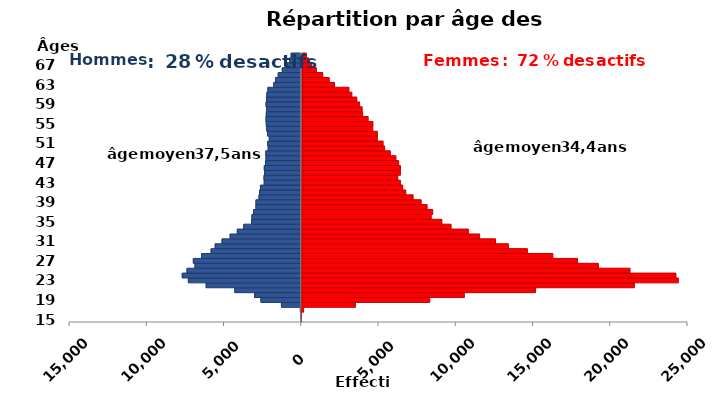
| Category | age | Homme | Femme |
|---|---|---|---|
| 15.0 | 15 | -3 | 1 |
| 16.0 | 16 | -20 | 28 |
| 17.0 | 17 | -58 | 170 |
| 18.0 | 18 | -1283 | 3526 |
| 19.0 | 19 | -2607 | 8332 |
| 20.0 | 20 | -3023 | 10571 |
| 21.0 | 21 | -4300 | 15178 |
| 22.0 | 22 | -6153 | 21572 |
| 23.0 | 23 | -7304 | 24417 |
| 24.0 | 24 | -7702 | 24260 |
| 25.0 | 25 | -7390 | 21288 |
| 26.0 | 26 | -6877 | 19240 |
| 27.0 | 27 | -6984 | 17889 |
| 28.0 | 28 | -6452 | 16291 |
| 29.0 | 29 | -5832 | 14640 |
| 30.0 | 30 | -5570 | 13410 |
| 31.0 | 31 | -5125 | 12574 |
| 32.0 | 32 | -4603 | 11548 |
| 33.0 | 33 | -4138 | 10814 |
| 34.0 | 34 | -3723 | 9696 |
| 35.0 | 35 | -3220 | 9101 |
| 36.0 | 36 | -3190 | 8407 |
| 37.0 | 37 | -3088 | 8506 |
| 38.0 | 38 | -2934 | 8141 |
| 39.0 | 39 | -2928 | 7755 |
| 40.0 | 40 | -2734 | 7233 |
| 41.0 | 41 | -2695 | 6757 |
| 42.0 | 42 | -2641 | 6556 |
| 43.0 | 43 | -2395 | 6405 |
| 44.0 | 44 | -2412 | 6237 |
| 45.0 | 45 | -2366 | 6406 |
| 46.0 | 46 | -2392 | 6409 |
| 47.0 | 47 | -2311 | 6288 |
| 48.0 | 48 | -2280 | 6113 |
| 49.0 | 49 | -2295 | 5753 |
| 50.0 | 50 | -2139 | 5380 |
| 51.0 | 51 | -2171 | 5280 |
| 52.0 | 52 | -2066 | 4903 |
| 53.0 | 53 | -2184 | 4904 |
| 54.0 | 54 | -2234 | 4606 |
| 55.0 | 55 | -2263 | 4617 |
| 56.0 | 56 | -2281 | 4307 |
| 57.0 | 57 | -2260 | 3947 |
| 58.0 | 58 | -2236 | 3916 |
| 59.0 | 59 | -2278 | 3749 |
| 60.0 | 60 | -2248 | 3567 |
| 61.0 | 61 | -2225 | 3247 |
| 62.0 | 62 | -2157 | 3059 |
| 63.0 | 63 | -1776 | 2122 |
| 64.0 | 64 | -1663 | 1778 |
| 65.0 | 65 | -1490 | 1361 |
| 66.0 | 66 | -1225 | 946 |
| 67.0 | 67 | -935 | 647 |
| 68.0 | 68 | -759 | 452 |
| 69.0 | 69 | -654 | 293 |